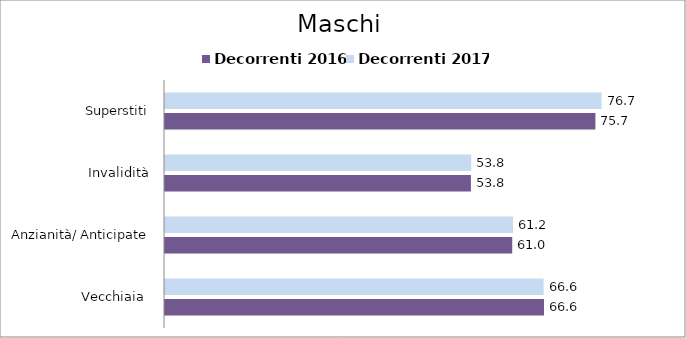
| Category | Decorrenti 2016 | Decorrenti 2017 |
|---|---|---|
| Vecchiaia  | 66.62 | 66.55 |
| Anzianità/ Anticipate | 61.04 | 61.19 |
| Invalidità | 53.77 | 53.83 |
| Superstiti | 75.66 | 76.73 |